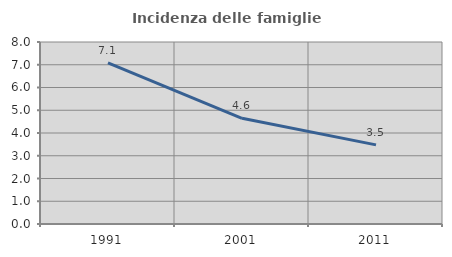
| Category | Incidenza delle famiglie numerose |
|---|---|
| 1991.0 | 7.084 |
| 2001.0 | 4.646 |
| 2011.0 | 3.477 |